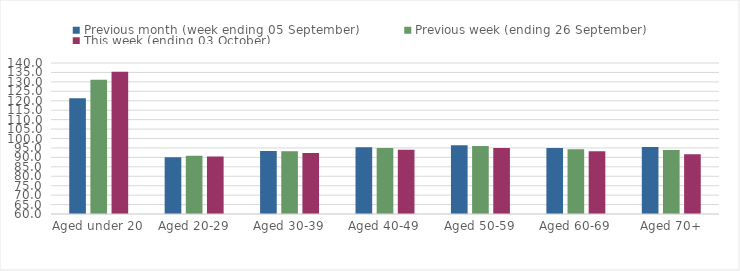
| Category | Previous month (week ending 05 September) | Previous week (ending 26 September) | This week (ending 03 October) |
|---|---|---|---|
| Aged under 20 | 121.36 | 131.07 | 135.35 |
| Aged 20-29 | 90.11 | 90.86 | 90.4 |
| Aged 30-39 | 93.4 | 93.31 | 92.29 |
| Aged 40-49 | 95.39 | 94.98 | 94.03 |
| Aged 50-59 | 96.48 | 95.99 | 95.01 |
| Aged 60-69 | 94.99 | 94.24 | 93.25 |
| Aged 70+ | 95.48 | 93.91 | 91.59 |